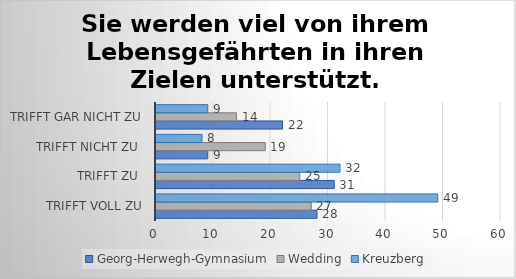
| Category | Georg-Herwegh-Gymnasium | Wedding | Kreuzberg |
|---|---|---|---|
| trifft voll zu | 28 | 27 | 49 |
| trifft zu  | 31 | 25 | 32 |
| trifft nicht zu  | 9 | 19 | 8 |
| trifft gar nicht zu | 22 | 14 | 9 |